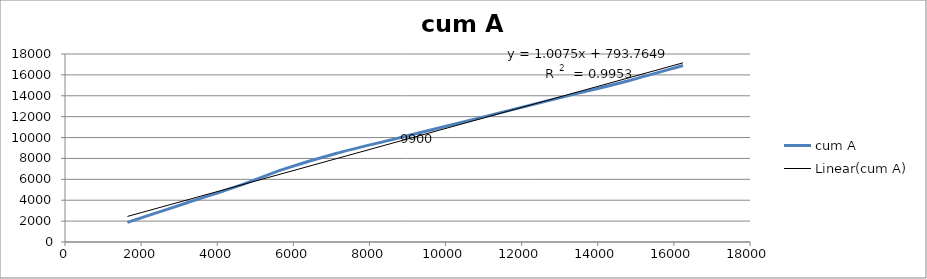
| Category | cum A |
|---|---|
| 1640.0 | 1880 |
| 3190.0 | 3730 |
| 4620.0 | 5450 |
| 5770.0 | 7000 |
| 7120.0 | 8480 |
| 8700.0 | 9900 |
| 10250.0 | 11300 |
| 11680.0 | 12600 |
| 13180.0 | 13970 |
| 14630.0 | 15270 |
| 16240.0 | 16900 |